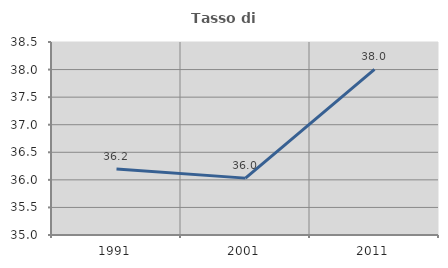
| Category | Tasso di occupazione   |
|---|---|
| 1991.0 | 36.196 |
| 2001.0 | 36.031 |
| 2011.0 | 38.004 |